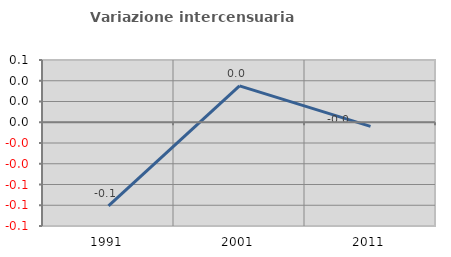
| Category | Variazione intercensuaria annua |
|---|---|
| 1991.0 | -0.081 |
| 2001.0 | 0.035 |
| 2011.0 | -0.004 |